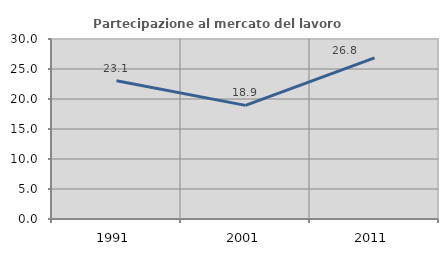
| Category | Partecipazione al mercato del lavoro  femminile |
|---|---|
| 1991.0 | 23.057 |
| 2001.0 | 18.942 |
| 2011.0 | 26.844 |